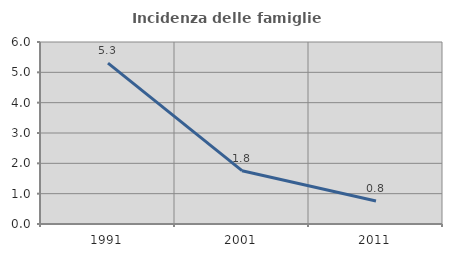
| Category | Incidenza delle famiglie numerose |
|---|---|
| 1991.0 | 5.303 |
| 2001.0 | 1.757 |
| 2011.0 | 0.76 |